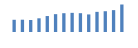
| Category | Exportações (1) |
|---|---|
| 0 | 203692.629 |
| 1 | 204985.899 |
| 2 | 199789.293 |
| 3 | 228223.553 |
| 4 | 265930.688 |
| 5 | 297441.741 |
| 6 | 313195.508 |
| 7 | 319331.634 |
| 8 | 313646.514 |
| 9 | 292708.824 |
| 10 | 335676.548 |
| 11 | 346139.442 |
| 12 | 364472.386 |
| 13 | 458340.369 |